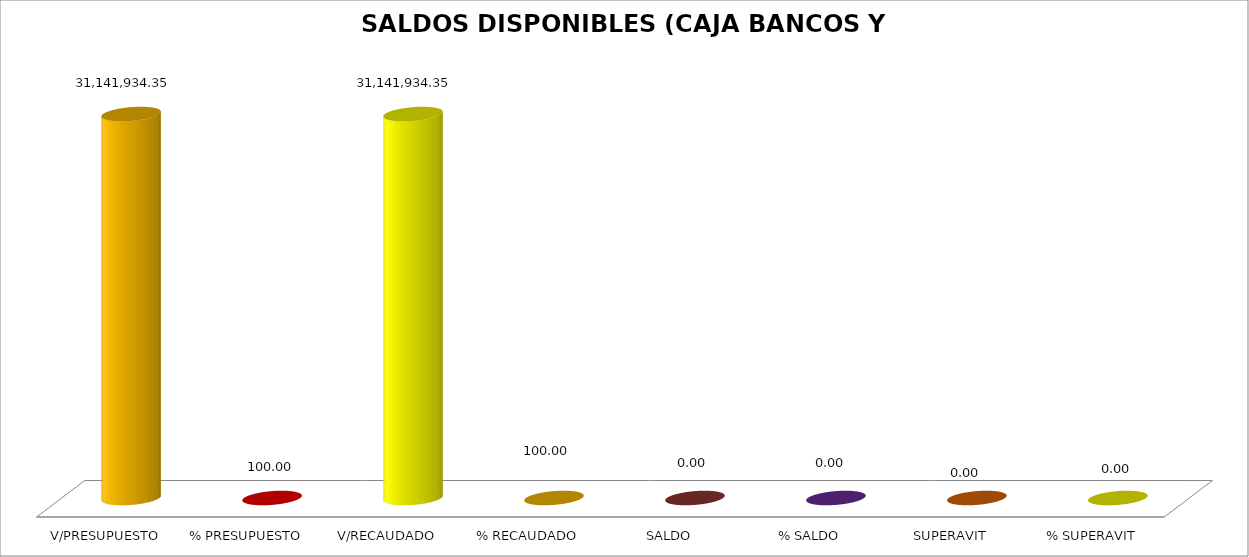
| Category | SALDOS DISPONIBLES (CAJA BANCOS Y FON-GARAN) |
|---|---|
| V/PRESUPUESTO | 31141934.35 |
| % PRESUPUESTO | 100 |
| V/RECAUDADO | 31141934.35 |
| % RECAUDADO | 100 |
| SALDO | 0 |
| % SALDO | 0 |
| SUPERAVIT | 0 |
| % SUPERAVIT | 0 |